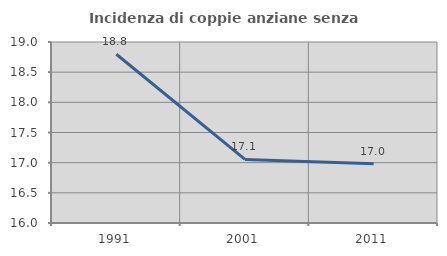
| Category | Incidenza di coppie anziane senza figli  |
|---|---|
| 1991.0 | 18.797 |
| 2001.0 | 17.054 |
| 2011.0 | 16.981 |